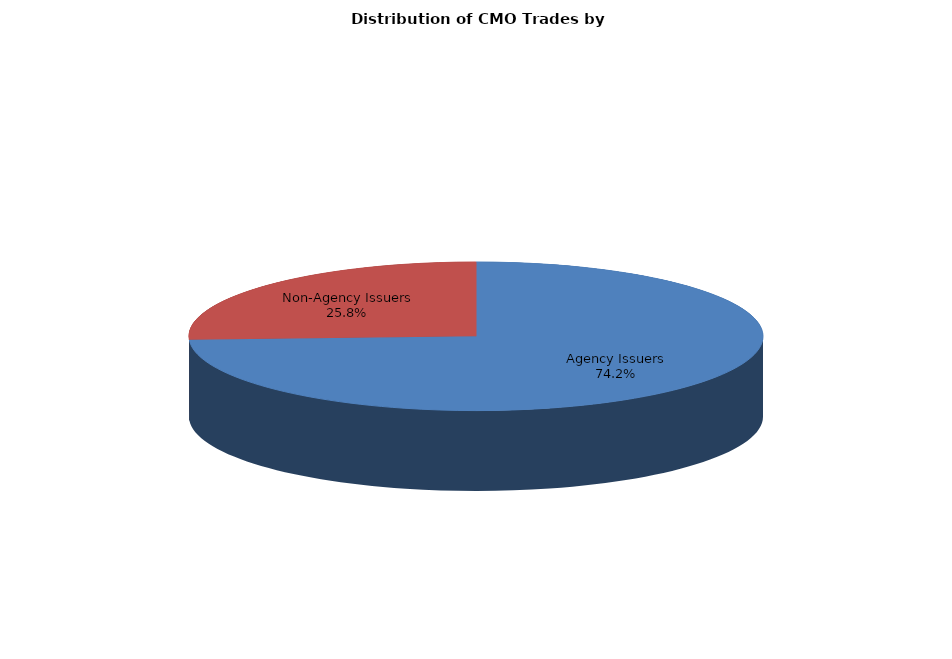
| Category | Series 0 |
|---|---|
| Agency Issuers | 1280.587 |
| Non-Agency Issuers | 444.353 |